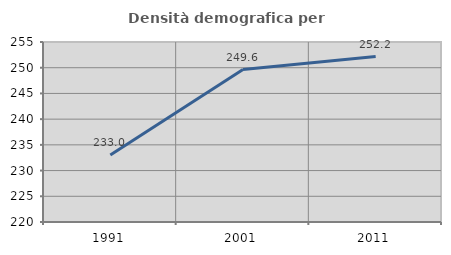
| Category | Densità demografica |
|---|---|
| 1991.0 | 233.015 |
| 2001.0 | 249.642 |
| 2011.0 | 252.168 |